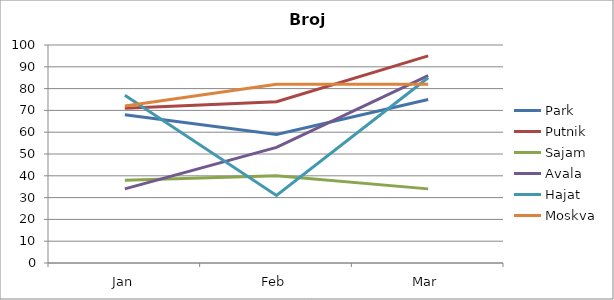
| Category | Park | Putnik | Sajam | Avala | Hajat | Moskva |
|---|---|---|---|---|---|---|
| Jan | 68 | 71 | 38 | 34 | 77 | 72 |
| Feb | 59 | 74 | 40 | 53 | 31 | 82 |
| Mar | 75 | 95 | 34 | 86 | 85 | 82 |